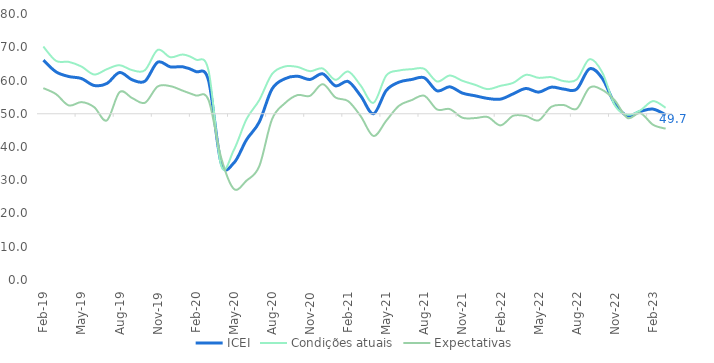
| Category | ICEI | Condições atuais | Expectativas |
|---|---|---|---|
| 2019-02-01 | 66.1 | 70.2 | 57.7 |
| 2019-03-01 | 62.6 | 65.9 | 55.9 |
| 2019-04-01 | 61.2 | 65.6 | 52.5 |
| 2019-05-01 | 60.6 | 64.2 | 53.5 |
| 2019-06-01 | 58.5 | 61.8 | 52 |
| 2019-07-01 | 59.1 | 63.4 | 48 |
| 2019-08-01 | 62.4 | 64.6 | 56.5 |
| 2019-09-01 | 60.2 | 63.1 | 54.7 |
| 2019-10-01 | 59.8 | 63.1 | 53.3 |
| 2019-11-01 | 65.5 | 69.2 | 58.2 |
| 2019-12-01 | 64.1 | 67 | 58.3 |
| 2020-01-01 | 64.1 | 67.8 | 56.9 |
| 2020-02-01 | 62.7 | 66.3 | 55.5 |
| 2020-03-01 | 60.1 | 63.1 | 54.2 |
| 2020-04-01 | 35.2 | 34.4 | 36.8 |
| 2020-05-01 | 35.2 | 39.1 | 27.4 |
| 2020-06-01 | 42.2 | 48.4 | 29.9 |
| 2020-07-01 | 47.5 | 54.1 | 34.2 |
| 2020-08-01 | 57.4 | 61.9 | 48.3 |
| 2020-09-01 | 60.5 | 64.2 | 53.1 |
| 2020-10-01 | 61.3 | 64.1 | 55.6 |
| 2020-11-01 | 60.3 | 62.8 | 55.4 |
| 2020-12-01 | 62 | 63.6 | 58.9 |
| 2021-01-01 | 58.4 | 60.2 | 54.9 |
| 2021-02-01 | 59.7 | 62.7 | 53.8 |
| 2021-03-01 | 55.3 | 58.4 | 49.2 |
| 2021-04-01 | 50 | 53.3 | 43.3 |
| 2021-05-01 | 57 | 61.5 | 47.9 |
| 2021-06-01 | 59.5 | 63 | 52.4 |
| 2021-07-01 | 60.3 | 63.4 | 54.1 |
| 2021-08-01 | 60.8 | 63.5 | 55.4 |
| 2021-09-01 | 56.9 | 59.7 | 51.3 |
| 2021-10-01 | 58.1 | 61.5 | 51.4 |
| 2021-11-01 | 56.2 | 59.9 | 48.8 |
| 2021-12-01 | 55.4 | 58.7 | 48.7 |
| 2022-01-01 | 54.6 | 57.4 | 49 |
| 2022-02-01 | 54.4 | 58.4 | 46.5 |
| 2022-03-01 | 56 | 59.3 | 49.4 |
| 2022-04-01 | 57.6 | 61.7 | 49.3 |
| 2022-05-01 | 56.5 | 60.8 | 48 |
| 2022-06-01 | 58 | 61 | 52.1 |
| 2022-07-01 | 57.4 | 59.8 | 52.6 |
| 2022-08-01 | 57.4 | 60.3 | 51.5 |
| 2022-09-01 | 63.5 | 66.4 | 57.8 |
| 2022-10-01 | 60.7 | 62.5 | 57.2 |
| 2022-11-01 | 53 | 52.5 | 54 |
| 2022-12-01 | 49.4 | 49.7 | 48.7 |
| 2023-01-01 | 50.7 | 51 | 50.2 |
| 2023-02-01 | 51.4 | 53.8 | 46.7 |
| 2023-03-01 | 49.7 | 51.8 | 45.5 |